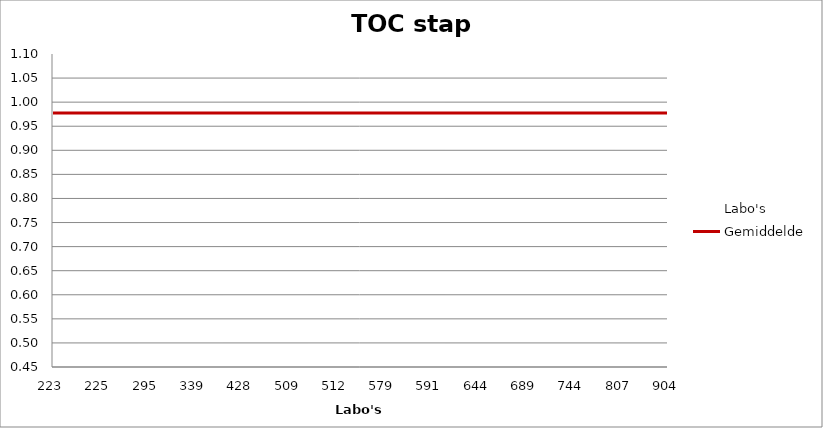
| Category | Labo's | Gemiddelde |
|---|---|---|
| 223.0 | 0.97 | 0.977 |
| 225.0 | 0.91 | 0.977 |
| 295.0 | 0.98 | 0.977 |
| 339.0 | 0.45 | 0.977 |
| 428.0 | 0.99 | 0.977 |
| 509.0 | 0.98 | 0.977 |
| 512.0 | 1.01 | 0.977 |
| 579.0 | 0.95 | 0.977 |
| 591.0 | 0.96 | 0.977 |
| 644.0 | 0.98 | 0.977 |
| 689.0 | 0.96 | 0.977 |
| 744.0 | 1.04 | 0.977 |
| 807.0 | 0.99 | 0.977 |
| 904.0 | 0.98 | 0.977 |